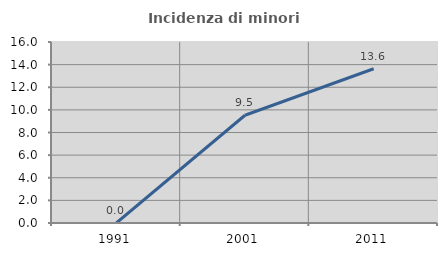
| Category | Incidenza di minori stranieri |
|---|---|
| 1991.0 | 0 |
| 2001.0 | 9.524 |
| 2011.0 | 13.636 |